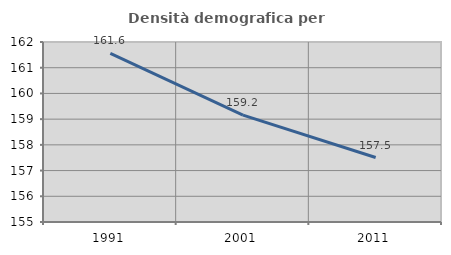
| Category | Densità demografica |
|---|---|
| 1991.0 | 161.555 |
| 2001.0 | 159.158 |
| 2011.0 | 157.508 |